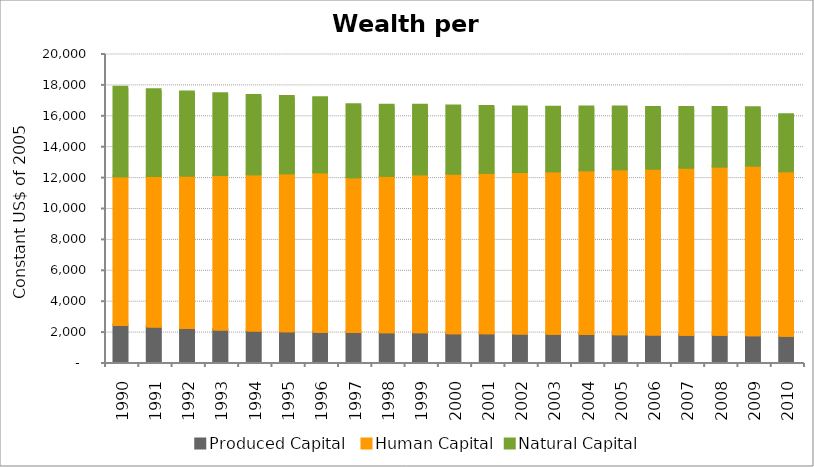
| Category | Produced Capital  | Human Capital | Natural Capital |
|---|---|---|---|
| 1990.0 | 2402.371 | 9616.26 | 5772.478 |
| 1991.0 | 2298.945 | 9739.816 | 5582.321 |
| 1992.0 | 2200.706 | 9863.727 | 5413.854 |
| 1993.0 | 2108.924 | 9987.715 | 5258.023 |
| 1994.0 | 2033.724 | 10111.879 | 5106.811 |
| 1995.0 | 1984.324 | 10235.428 | 4962.96 |
| 1996.0 | 1958.882 | 10327.033 | 4824.119 |
| 1997.0 | 1937.934 | 10022.284 | 4690.606 |
| 1998.0 | 1925.467 | 10124.769 | 4572.749 |
| 1999.0 | 1923.72 | 10227.315 | 4462.99 |
| 2000.0 | 1867.205 | 10328.221 | 4369.802 |
| 2001.0 | 1853.046 | 10389.997 | 4287.443 |
| 2002.0 | 1843.509 | 10454.345 | 4213.627 |
| 2003.0 | 1830.372 | 10522.891 | 4139.93 |
| 2004.0 | 1819.205 | 10597.75 | 4087.566 |
| 2005.0 | 1802.539 | 10678.37 | 4027.738 |
| 2006.0 | 1778.243 | 10740.014 | 3952.102 |
| 2007.0 | 1764.912 | 10816.927 | 3885.102 |
| 2008.0 | 1756.119 | 10903.868 | 3805.711 |
| 2009.0 | 1729.679 | 10993.771 | 3724.936 |
| 2010.0 | 1699.285 | 10654.896 | 3644.686 |